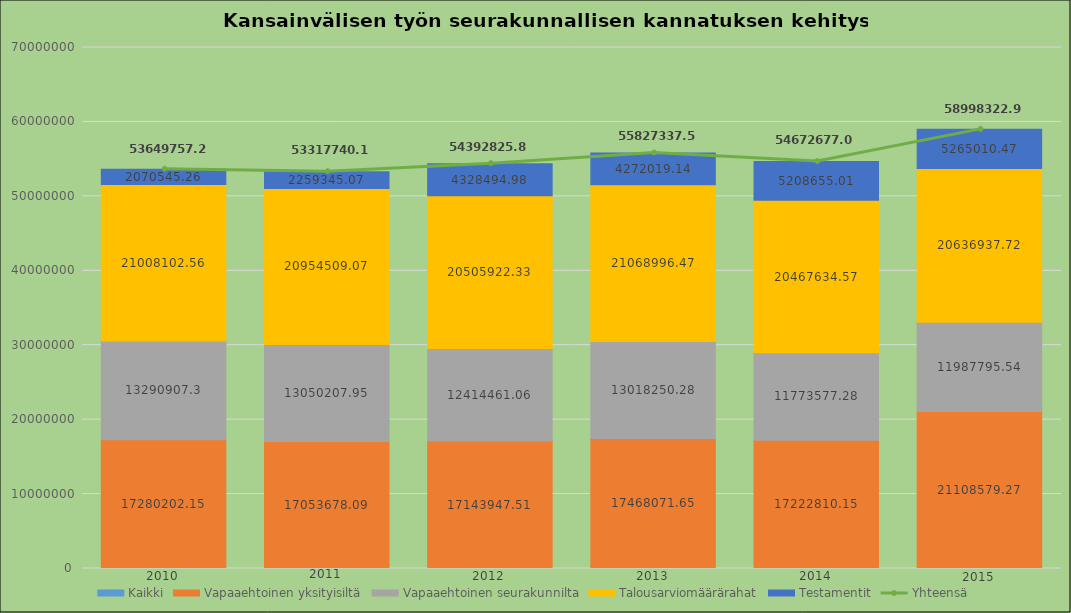
| Category | Kaikki | Vapaaehtoinen yksityisiltä | Vapaaehtoinen seurakunnilta | Talousarviomäärärahat | Testamentit |
|---|---|---|---|---|---|
| 0 | 2010 | 17280202.15 | 13290907.3 | 21008102.56 | 2070545.26 |
| 1 | 2011 | 17053678.092 | 13050207.951 | 20954509.07 | 2259345.07 |
| 2 | 2012 | 17143947.509 | 12414461.065 | 20505922.334 | 4328494.98 |
| 3 | 2013 | 17468071.648 | 13018250.279 | 21068996.47 | 4272019.14 |
| 4 | 2014 | 17222810.152 | 11773577.28 | 20467634.57 | 5208655.01 |
| 5 | 2015 | 21108579.267 | 11987795.537 | 20636937.72 | 5265010.47 |